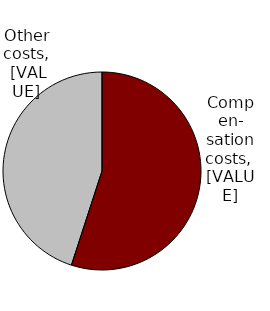
| Category | Series 0 |
|---|---|
| Self-employed | 0.55 |
| Plan at work, not included | 0.45 |